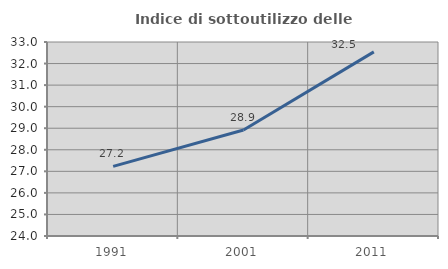
| Category | Indice di sottoutilizzo delle abitazioni  |
|---|---|
| 1991.0 | 27.228 |
| 2001.0 | 28.915 |
| 2011.0 | 32.54 |